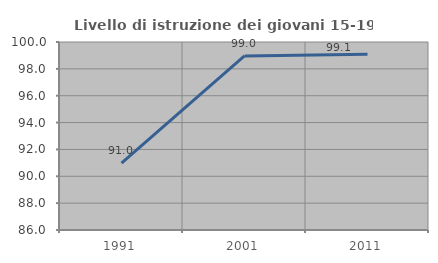
| Category | Livello di istruzione dei giovani 15-19 anni |
|---|---|
| 1991.0 | 90.977 |
| 2001.0 | 98.966 |
| 2011.0 | 99.095 |